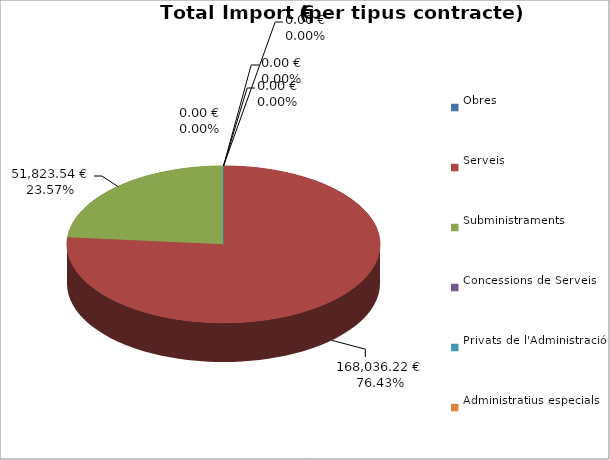
| Category | Total preu
(amb IVA) |
|---|---|
| Obres | 0 |
| Serveis | 168036.22 |
| Subministraments | 51823.54 |
| Concessions de Serveis | 0 |
| Privats de l'Administració | 0 |
| Administratius especials | 0 |